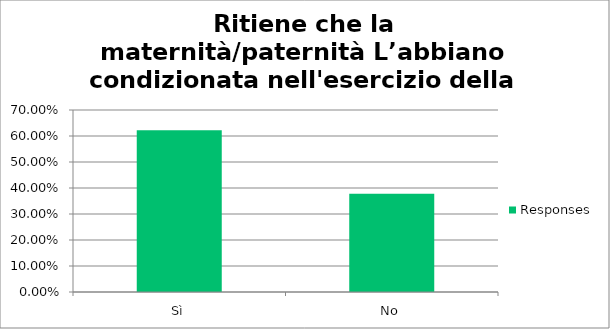
| Category | Responses |
|---|---|
| Sì | 0.622 |
| No | 0.378 |